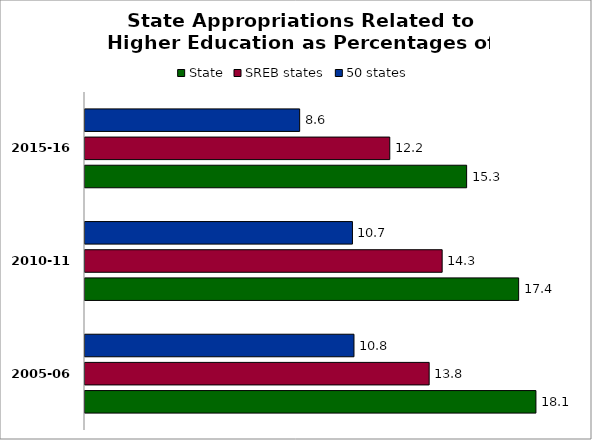
| Category | State | SREB states | 50 states |
|---|---|---|---|
| 2005-06 | 18.11 | 13.822 | 10.802 |
| 2010-11 | 17.415 | 14.344 | 10.741 |
| 2015-16 | 15.327 | 12.24 | 8.621 |